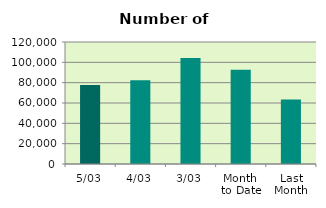
| Category | Series 0 |
|---|---|
| 5/03 | 77700 |
| 4/03 | 82366 |
| 3/03 | 104356 |
| Month 
to Date | 92626.5 |
| Last
Month | 63353.4 |